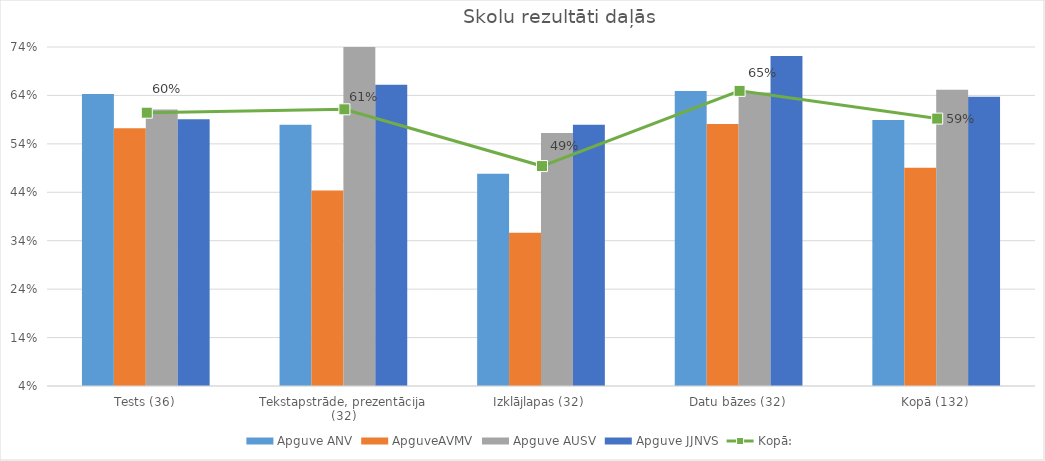
| Category | Apguve ANV | ApguveAVMV | Apguve AUSV | Apguve JJNVS |
|---|---|---|---|---|
| Tests (36) | 0.643 | 0.572 | 0.611 | 0.591 |
| Tekstapstrāde, prezentācija (32) | 0.579 | 0.444 | 0.76 | 0.662 |
| Izklājlapas (32) | 0.478 | 0.356 | 0.562 | 0.58 |
| Datu bāzes (32) | 0.649 | 0.581 | 0.646 | 0.722 |
| Kopā (132) | 0.589 | 0.491 | 0.652 | 0.637 |